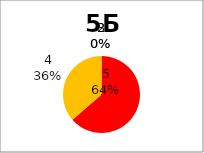
| Category | Series 0 |
|---|---|
| 5.0 | 7 |
| 4.0 | 4 |
| 3.0 | 0 |
| 2.0 | 0 |